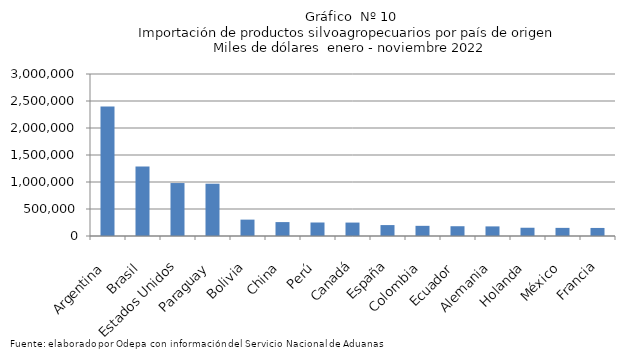
| Category | Series 0 |
|---|---|
| Argentina | 2398148.859 |
| Brasil | 1287475.645 |
| Estados Unidos | 980730.559 |
| Paraguay | 968339.052 |
| Bolivia | 303252.128 |
| China | 257564.013 |
| Perú | 249995.679 |
| Canadá | 248589.1 |
| España | 202281.085 |
| Colombia | 188282.798 |
| Ecuador | 180980.528 |
| Alemania | 177845.999 |
| Holanda | 152935.681 |
| México | 150475.141 |
| Francia | 149108.799 |